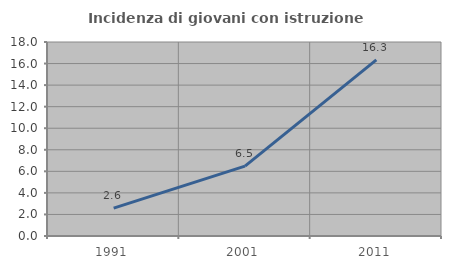
| Category | Incidenza di giovani con istruzione universitaria |
|---|---|
| 1991.0 | 2.581 |
| 2001.0 | 6.49 |
| 2011.0 | 16.337 |